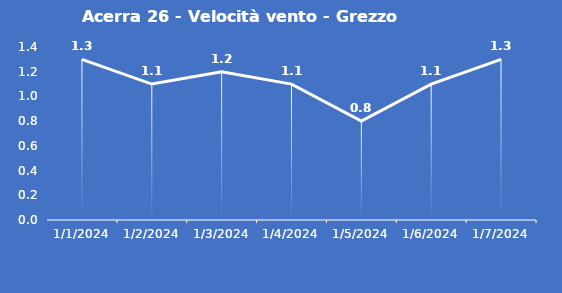
| Category | Acerra 26 - Velocità vento - Grezzo (m/s) |
|---|---|
| 1/1/24 | 1.3 |
| 1/2/24 | 1.1 |
| 1/3/24 | 1.2 |
| 1/4/24 | 1.1 |
| 1/5/24 | 0.8 |
| 1/6/24 | 1.1 |
| 1/7/24 | 1.3 |